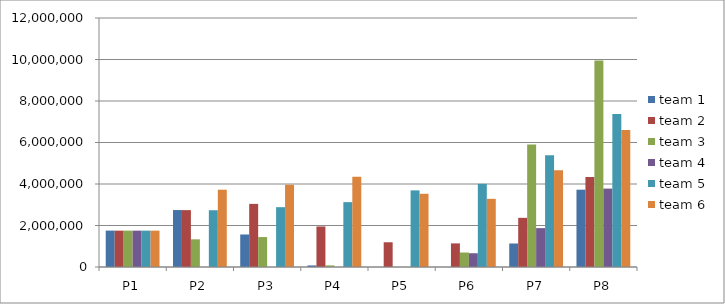
| Category | team 1 | team 2 | team 3 | team 4 | team 5 | team 6 |
|---|---|---|---|---|---|---|
| P1 | 1755000 | 1752000 | 1752000 | 1752000 | 1752000 | 1752000 |
| P2 | 2745000 | 2741000 | 1333000 | 0 | 2736000 | 3725000 |
| P3 | 1567000 | 3042000 | 1443000 | 0 | 2883000 | 3964000 |
| P4 | 76000 | 1953000 | 76000 | 0 | 3126000 | 4351000 |
| P5 | 0 | 1192000 | 0 | 0 | 3693000 | 3528500 |
| P6 | 0 | 1138000 | 697600 | 662700 | 4006500 | 3285000 |
| P7 | 1133000 | 2369400 | 5898000 | 1873000 | 5388000 | 4662000 |
| P8 | 3726000 | 4337000 | 9952000 | 3778000 | 7370000 | 6605000 |